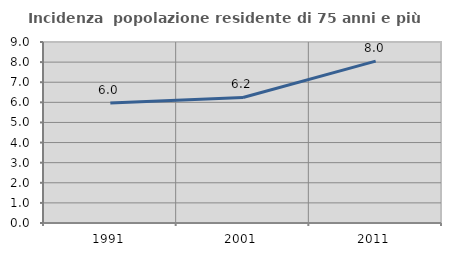
| Category | Incidenza  popolazione residente di 75 anni e più |
|---|---|
| 1991.0 | 5.971 |
| 2001.0 | 6.241 |
| 2011.0 | 8.047 |